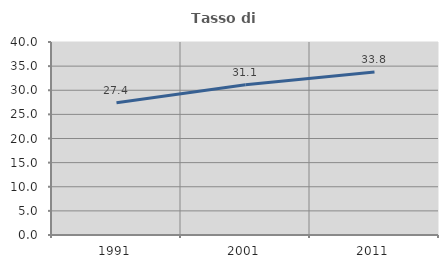
| Category | Tasso di occupazione   |
|---|---|
| 1991.0 | 27.41 |
| 2001.0 | 31.142 |
| 2011.0 | 33.779 |